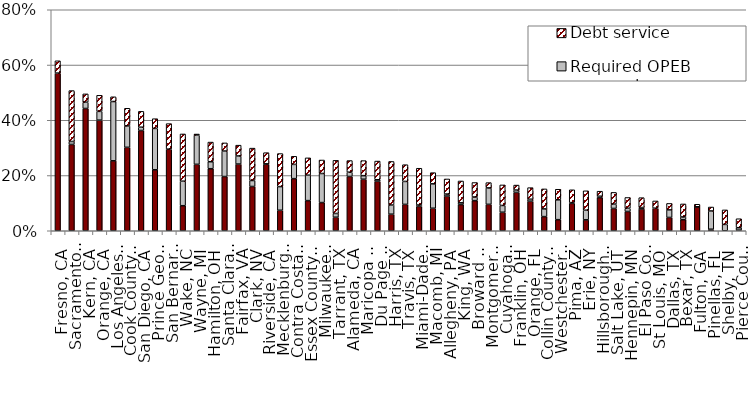
| Category | Required pension payments | Required OPEB payments | Debt service |
|---|---|---|---|
| Fresno, CA | 0.571 | 0 | 0.045 |
| Sacramento, CA | 0.312 | 0.011 | 0.184 |
| Kern, CA | 0.443 | 0.023 | 0.03 |
| Orange, CA | 0.4 | 0.032 | 0.058 |
| Los Angeles, CA | 0.253 | 0.215 | 0.017 |
| Cook County, IL | 0.302 | 0.077 | 0.064 |
| San Diego, CA | 0.363 | 0.012 | 0.057 |
| Prince Georges County, MD | 0.221 | 0.15 | 0.035 |
| San Bernardino, CA | 0.295 | 0 | 0.092 |
| Wake, NC | 0.091 | 0.089 | 0.171 |
| Wayne, MI | 0.24 | 0.106 | 0.004 |
| Hamilton, OH | 0.225 | 0.025 | 0.071 |
| Santa Clara, CA | 0.196 | 0.092 | 0.029 |
| Fairfax, VA | 0.241 | 0.029 | 0.039 |
| Clark, NV | 0.16 | 0.022 | 0.117 |
| Riverside, CA | 0.241 | 0.002 | 0.04 |
| Mecklenburg, NC | 0.074 | 0.086 | 0.12 |
| Contra Costa, CA | 0.189 | 0.052 | 0.029 |
| Essex County, NJ | 0.109 | 0.092 | 0.063 |
| Milwaukee, WI | 0.102 | 0.105 | 0.049 |
| Tarrant, TX | 0.049 | 0.014 | 0.192 |
| Alameda, CA | 0.196 | 0.016 | 0.042 |
| Maricopa County, AZ | 0.186 | 0.013 | 0.054 |
| Du Page County, IL | 0.179 | 0.006 | 0.068 |
| Harris, TX | 0.06 | 0.033 | 0.158 |
| Travis, TX | 0.095 | 0.083 | 0.061 |
| Miami-Dade, FL | 0.088 | 0.005 | 0.133 |
| Macomb, MI | 0.081 | 0.088 | 0.04 |
| Allegheny, PA | 0.126 | 0.007 | 0.055 |
| King, WA | 0.095 | 0.006 | 0.079 |
| Broward County, FL | 0.109 | 0.013 | 0.052 |
| Montgomery County, MD | 0.096 | 0.06 | 0.019 |
| Cuyahoga, OH | 0.067 | 0.025 | 0.074 |
| Franklin, OH | 0.139 | 0.008 | 0.018 |
| Orange, FL | 0.107 | 0.007 | 0.042 |
| Collin County, TX | 0.051 | 0.028 | 0.072 |
| Westchester, NY | 0.04 | 0.072 | 0.038 |
| Pima, AZ | 0.099 | 0.003 | 0.046 |
| Erie, NY | 0.04 | 0.035 | 0.07 |
| Hillsborough, FL | 0.12 | 0.005 | 0.018 |
| Salt Lake, UT | 0.081 | 0.016 | 0.042 |
| Hennepin, MN | 0.07 | 0.012 | 0.039 |
| El Paso County, TX | 0.079 | 0.005 | 0.036 |
| St Louis, MO | 0.082 | 0 | 0.026 |
| Dallas, TX | 0.048 | 0.027 | 0.023 |
| Bexar, TX | 0.04 | 0.01 | 0.047 |
| Fulton, GA | 0.087 | 0 | 0.009 |
| Pinellas, FL | 0.005 | 0.066 | 0.014 |
| Shelby, TN | 0 | 0.023 | 0.053 |
| Pierce County, WA | 0.002 | 0.009 | 0.032 |